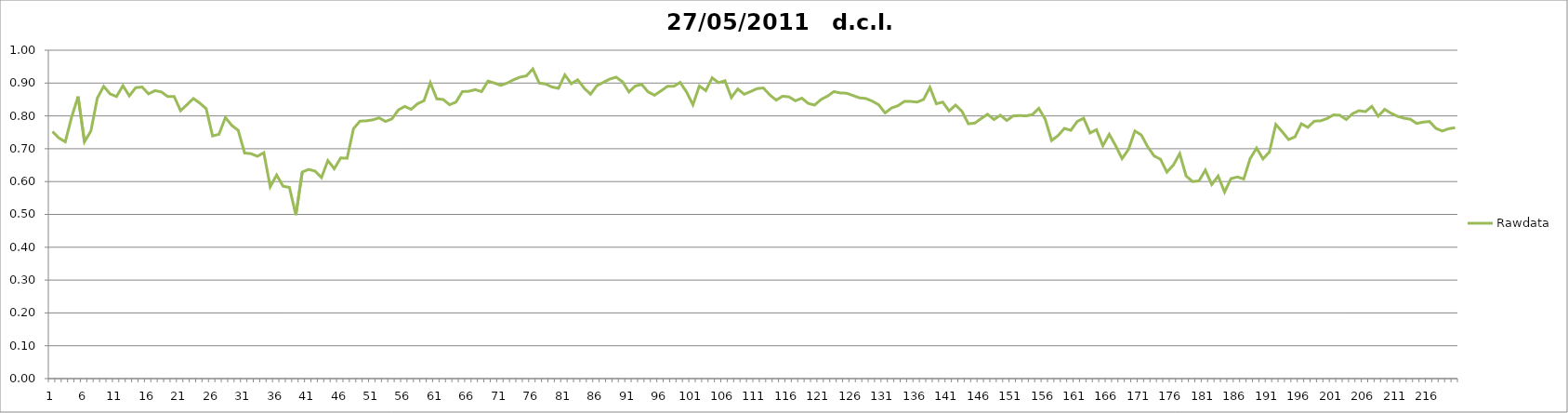
| Category | Rawdata |
|---|---|
| 0 | 0.752 |
| 1 | 0.733 |
| 2 | 0.721 |
| 3 | 0.797 |
| 4 | 0.859 |
| 5 | 0.721 |
| 6 | 0.754 |
| 7 | 0.854 |
| 8 | 0.89 |
| 9 | 0.867 |
| 10 | 0.859 |
| 11 | 0.892 |
| 12 | 0.861 |
| 13 | 0.886 |
| 14 | 0.888 |
| 15 | 0.867 |
| 16 | 0.877 |
| 17 | 0.873 |
| 18 | 0.859 |
| 19 | 0.859 |
| 20 | 0.816 |
| 21 | 0.834 |
| 22 | 0.853 |
| 23 | 0.839 |
| 24 | 0.822 |
| 25 | 0.739 |
| 26 | 0.744 |
| 27 | 0.795 |
| 28 | 0.771 |
| 29 | 0.756 |
| 30 | 0.687 |
| 31 | 0.685 |
| 32 | 0.677 |
| 33 | 0.688 |
| 34 | 0.584 |
| 35 | 0.62 |
| 36 | 0.586 |
| 37 | 0.582 |
| 38 | 0.498 |
| 39 | 0.629 |
| 40 | 0.637 |
| 41 | 0.632 |
| 42 | 0.612 |
| 43 | 0.664 |
| 44 | 0.639 |
| 45 | 0.672 |
| 46 | 0.671 |
| 47 | 0.761 |
| 48 | 0.784 |
| 49 | 0.785 |
| 50 | 0.788 |
| 51 | 0.794 |
| 52 | 0.783 |
| 53 | 0.791 |
| 54 | 0.818 |
| 55 | 0.829 |
| 56 | 0.82 |
| 57 | 0.837 |
| 58 | 0.846 |
| 59 | 0.901 |
| 60 | 0.852 |
| 61 | 0.85 |
| 62 | 0.834 |
| 63 | 0.842 |
| 64 | 0.874 |
| 65 | 0.875 |
| 66 | 0.88 |
| 67 | 0.874 |
| 68 | 0.906 |
| 69 | 0.9 |
| 70 | 0.893 |
| 71 | 0.9 |
| 72 | 0.91 |
| 73 | 0.918 |
| 74 | 0.922 |
| 75 | 0.943 |
| 76 | 0.9 |
| 77 | 0.897 |
| 78 | 0.888 |
| 79 | 0.884 |
| 80 | 0.925 |
| 81 | 0.898 |
| 82 | 0.91 |
| 83 | 0.885 |
| 84 | 0.866 |
| 85 | 0.892 |
| 86 | 0.902 |
| 87 | 0.912 |
| 88 | 0.918 |
| 89 | 0.904 |
| 90 | 0.873 |
| 91 | 0.891 |
| 92 | 0.896 |
| 93 | 0.873 |
| 94 | 0.863 |
| 95 | 0.876 |
| 96 | 0.89 |
| 97 | 0.89 |
| 98 | 0.902 |
| 99 | 0.873 |
| 100 | 0.834 |
| 101 | 0.891 |
| 102 | 0.877 |
| 103 | 0.916 |
| 104 | 0.901 |
| 105 | 0.907 |
| 106 | 0.856 |
| 107 | 0.882 |
| 108 | 0.866 |
| 109 | 0.874 |
| 110 | 0.883 |
| 111 | 0.885 |
| 112 | 0.864 |
| 113 | 0.848 |
| 114 | 0.86 |
| 115 | 0.858 |
| 116 | 0.846 |
| 117 | 0.854 |
| 118 | 0.838 |
| 119 | 0.833 |
| 120 | 0.85 |
| 121 | 0.86 |
| 122 | 0.874 |
| 123 | 0.87 |
| 124 | 0.869 |
| 125 | 0.862 |
| 126 | 0.855 |
| 127 | 0.853 |
| 128 | 0.845 |
| 129 | 0.834 |
| 130 | 0.809 |
| 131 | 0.824 |
| 132 | 0.831 |
| 133 | 0.844 |
| 134 | 0.844 |
| 135 | 0.842 |
| 136 | 0.85 |
| 137 | 0.887 |
| 138 | 0.837 |
| 139 | 0.842 |
| 140 | 0.815 |
| 141 | 0.833 |
| 142 | 0.814 |
| 143 | 0.776 |
| 144 | 0.778 |
| 145 | 0.792 |
| 146 | 0.805 |
| 147 | 0.789 |
| 148 | 0.802 |
| 149 | 0.786 |
| 150 | 0.8 |
| 151 | 0.801 |
| 152 | 0.8 |
| 153 | 0.804 |
| 154 | 0.823 |
| 155 | 0.79 |
| 156 | 0.725 |
| 157 | 0.74 |
| 158 | 0.762 |
| 159 | 0.756 |
| 160 | 0.783 |
| 161 | 0.793 |
| 162 | 0.748 |
| 163 | 0.758 |
| 164 | 0.709 |
| 165 | 0.744 |
| 166 | 0.709 |
| 167 | 0.67 |
| 168 | 0.698 |
| 169 | 0.754 |
| 170 | 0.742 |
| 171 | 0.706 |
| 172 | 0.678 |
| 173 | 0.668 |
| 174 | 0.629 |
| 175 | 0.65 |
| 176 | 0.685 |
| 177 | 0.617 |
| 178 | 0.6 |
| 179 | 0.602 |
| 180 | 0.635 |
| 181 | 0.591 |
| 182 | 0.617 |
| 183 | 0.568 |
| 184 | 0.609 |
| 185 | 0.614 |
| 186 | 0.608 |
| 187 | 0.67 |
| 188 | 0.702 |
| 189 | 0.669 |
| 190 | 0.69 |
| 191 | 0.774 |
| 192 | 0.752 |
| 193 | 0.728 |
| 194 | 0.736 |
| 195 | 0.776 |
| 196 | 0.765 |
| 197 | 0.784 |
| 198 | 0.785 |
| 199 | 0.792 |
| 200 | 0.803 |
| 201 | 0.802 |
| 202 | 0.789 |
| 203 | 0.807 |
| 204 | 0.816 |
| 205 | 0.813 |
| 206 | 0.829 |
| 207 | 0.799 |
| 208 | 0.82 |
| 209 | 0.808 |
| 210 | 0.799 |
| 211 | 0.793 |
| 212 | 0.79 |
| 213 | 0.777 |
| 214 | 0.781 |
| 215 | 0.783 |
| 216 | 0.762 |
| 217 | 0.754 |
| 218 | 0.761 |
| 219 | 0.764 |